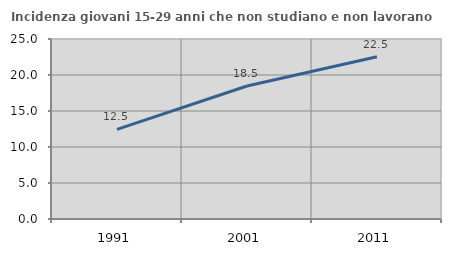
| Category | Incidenza giovani 15-29 anni che non studiano e non lavorano  |
|---|---|
| 1991.0 | 12.456 |
| 2001.0 | 18.471 |
| 2011.0 | 22.527 |